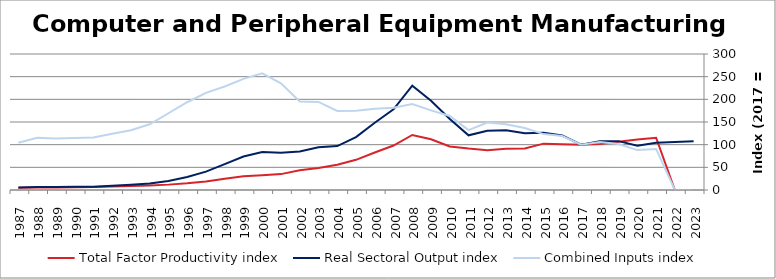
| Category | Total Factor Productivity index | Real Sectoral Output index | Combined Inputs index |
|---|---|---|---|
| 2023.0 | 0 | 107.524 | 0 |
| 2022.0 | 0 | 106.127 | 0 |
| 2021.0 | 115.291 | 104.469 | 90.613 |
| 2020.0 | 111.283 | 97.913 | 87.986 |
| 2019.0 | 106.35 | 107.755 | 101.321 |
| 2018.0 | 101.58 | 107.762 | 106.087 |
| 2017.0 | 100 | 100 | 100 |
| 2016.0 | 100.881 | 120.072 | 119.024 |
| 2015.0 | 102.249 | 126.059 | 123.287 |
| 2014.0 | 91.622 | 125.237 | 136.688 |
| 2013.0 | 91.038 | 132.011 | 145.007 |
| 2012.0 | 87.868 | 130.686 | 148.731 |
| 2011.0 | 91.359 | 120.658 | 132.07 |
| 2010.0 | 95.933 | 156.767 | 163.414 |
| 2009.0 | 111.988 | 196.751 | 175.69 |
| 2008.0 | 121.431 | 230.137 | 189.521 |
| 2007.0 | 98.075 | 177.898 | 181.389 |
| 2006.0 | 82.772 | 148.495 | 179.403 |
| 2005.0 | 66.6 | 116.562 | 175.017 |
| 2004.0 | 55.596 | 96.922 | 174.331 |
| 2003.0 | 48.478 | 94.208 | 194.333 |
| 2002.0 | 43.535 | 84.917 | 195.053 |
| 2001.0 | 35.04 | 82.403 | 235.172 |
| 2000.0 | 32.623 | 83.986 | 257.448 |
| 1999.0 | 30.074 | 73.745 | 245.208 |
| 1998.0 | 25.048 | 57.177 | 228.267 |
| 1997.0 | 18.946 | 40.614 | 214.371 |
| 1996.0 | 14.751 | 28.556 | 193.586 |
| 1995.0 | 11.854 | 20.068 | 169.288 |
| 1994.0 | 9.898 | 14.339 | 144.873 |
| 1993.0 | 8.638 | 11.385 | 131.802 |
| 1992.0 | 7.46 | 9.268 | 124.236 |
| 1991.0 | 6.417 | 7.442 | 115.977 |
| 1990.0 | 6.161 | 7.084 | 114.972 |
| 1989.0 | 5.764 | 6.556 | 113.726 |
| 1988.0 | 5.555 | 6.406 | 115.314 |
| 1987.0 | 5.081 | 5.293 | 104.171 |